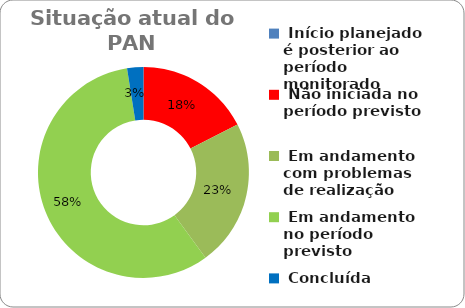
| Category | Series 0 |
|---|---|
|  Início planejado é posterior ao período monitorado | 0 |
|  Não iniciada no período previsto | 0.175 |
|  Em andamento com problemas de realização | 0.225 |
|  Em andamento no período previsto  | 0.575 |
|  Concluída | 0.025 |